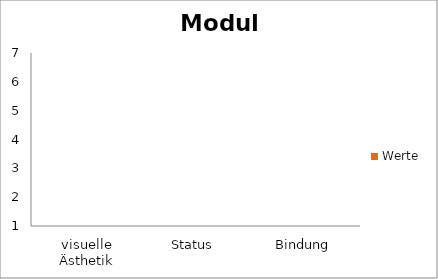
| Category | Werte |
|---|---|
| visuelle Ästhetik | 0 |
| Status  | 0 |
| Bindung | 0 |